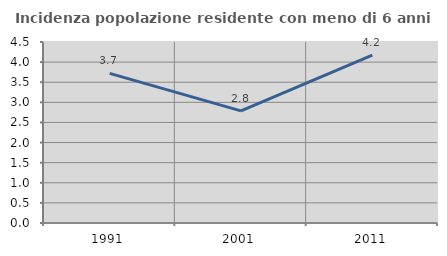
| Category | Incidenza popolazione residente con meno di 6 anni |
|---|---|
| 1991.0 | 3.719 |
| 2001.0 | 2.789 |
| 2011.0 | 4.176 |